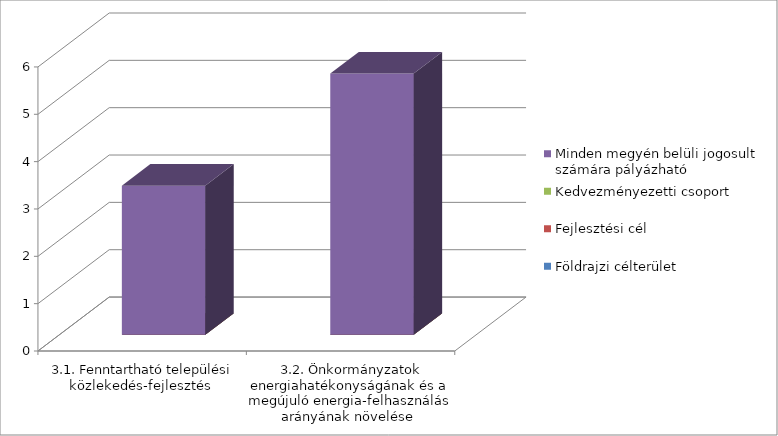
| Category | Földrajzi célterület  | Fejlesztési cél  | Kedvezményezetti csoport | Minden megyén belüli jogosult számára pályázható   |
|---|---|---|---|---|
| 3.1. Fenntartható települési közlekedés-fejlesztés | 0 | 0 | 0 | 3.151 |
| 3.2. Önkormányzatok energiahatékonyságának és a megújuló energia-felhasználás arányának növelése | 0 | 0 | 0 | 5.52 |